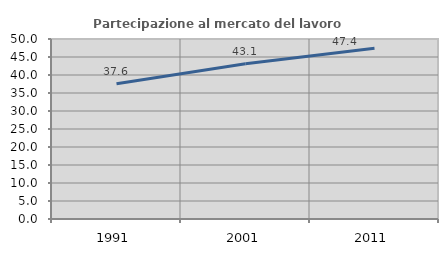
| Category | Partecipazione al mercato del lavoro  femminile |
|---|---|
| 1991.0 | 37.597 |
| 2001.0 | 43.113 |
| 2011.0 | 47.44 |